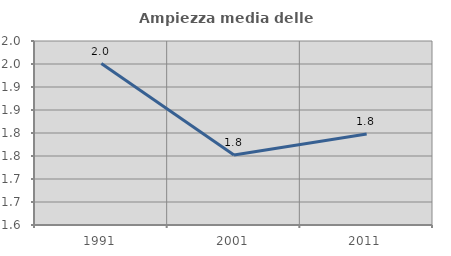
| Category | Ampiezza media delle famiglie |
|---|---|
| 1991.0 | 1.951 |
| 2001.0 | 1.752 |
| 2011.0 | 1.798 |